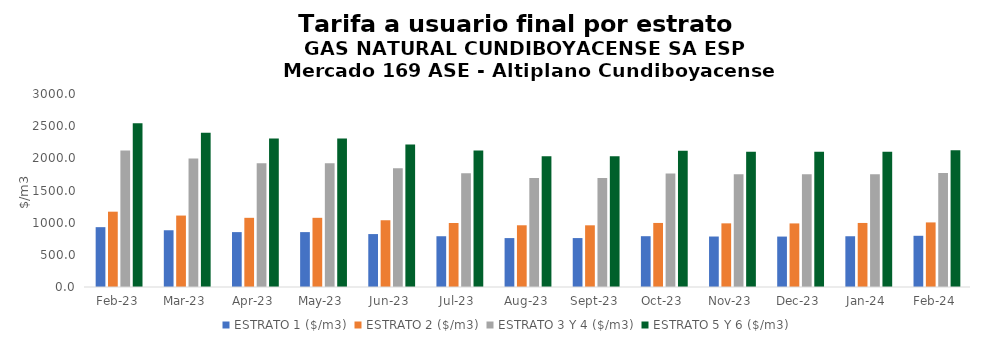
| Category | ESTRATO 1 ($/m3) | ESTRATO 2 ($/m3) | ESTRATO 3 Y 4 ($/m3) | ESTRATO 5 Y 6 ($/m3) |
|---|---|---|---|---|
| 2023-02-01 | 930.14 | 1170.78 | 2119.87 | 2543.844 |
| 2023-03-01 | 882 | 1110.47 | 1998.36 | 2398.032 |
| 2023-04-01 | 853.19 | 1075.46 | 1923.35 | 2308.02 |
| 2023-05-01 | 853.19 | 1075.46 | 1923.35 | 2308.02 |
| 2023-06-01 | 822.7 | 1037.61 | 1845.24 | 2214.288 |
| 2023-07-01 | 788.93 | 994.99 | 1769.1 | 2122.92 |
| 2023-08-01 | 760.33 | 959.38 | 1694.56 | 2033.472 |
| 2023-09-01 | 760.57 | 958.84 | 1694.55 | 2033.46 |
| 2023-10-01 | 789.68 | 995.66 | 1764.51 | 2117.412 |
| 2023-11-01 | 784.66 | 989.45 | 1750.95 | 2101.14 |
| 2023-12-01 | 783.85 | 988.36 | 1750.95 | 2101.14 |
| 2024-01-01 | 788.85 | 995.5 | 1752.45 | 2102.94 |
| 2024-02-01 | 796.03 | 1003.92 | 1770.22 | 2124.264 |